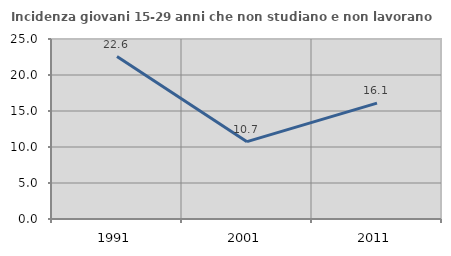
| Category | Incidenza giovani 15-29 anni che non studiano e non lavorano  |
|---|---|
| 1991.0 | 22.563 |
| 2001.0 | 10.744 |
| 2011.0 | 16.094 |